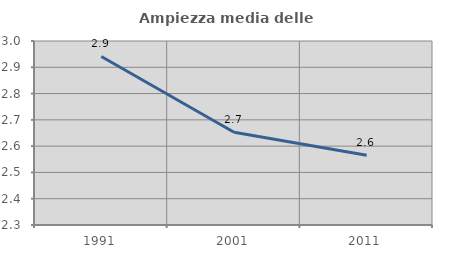
| Category | Ampiezza media delle famiglie |
|---|---|
| 1991.0 | 2.941 |
| 2001.0 | 2.653 |
| 2011.0 | 2.566 |